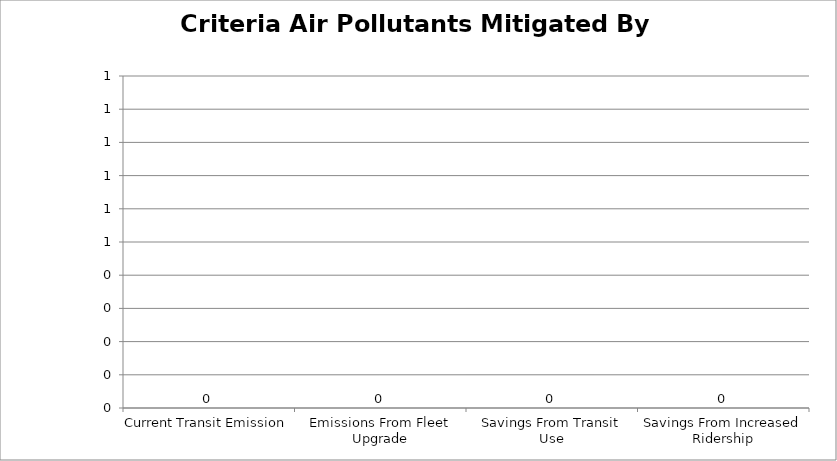
| Category | Criteria Air Pollutants Mitigated By Transit |
|---|---|
| Current Transit Emission | 0 |
| Emissions From Fleet Upgrade | 0 |
| Savings From Transit Use | 0 |
| Savings From Increased Ridership | 0 |